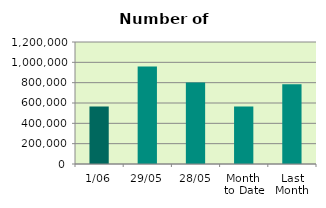
| Category | Series 0 |
|---|---|
| 1/06 | 566580 |
| 29/05 | 959850 |
| 28/05 | 802046 |
| Month 
to Date | 566580 |
| Last
Month | 785067 |